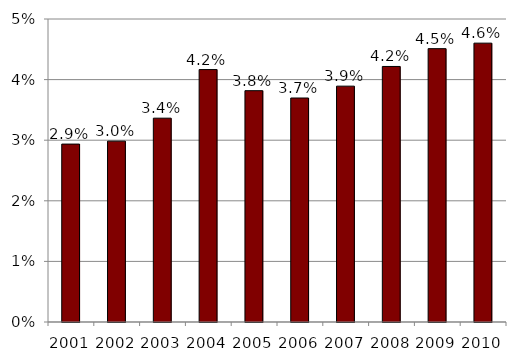
| Category | Contributions/Revenue |
|---|---|
| 2001.0 | 0.029 |
| 2002.0 | 0.03 |
| 2003.0 | 0.034 |
| 2004.0 | 0.042 |
| 2005.0 | 0.038 |
| 2006.0 | 0.037 |
| 2007.0 | 0.039 |
| 2008.0 | 0.042 |
| 2009.0 | 0.045 |
| 2010.0 | 0.046 |